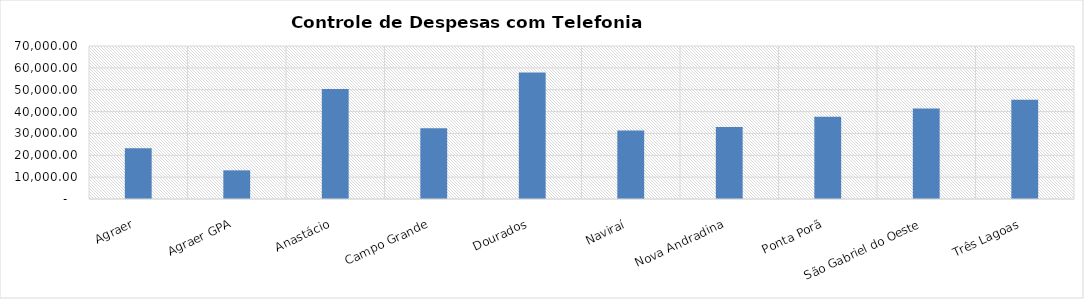
| Category | Series 0 |
|---|---|
| Agraer | 23269.63 |
| Agraer GPA | 13112.44 |
| Anastácio | 50313.66 |
| Campo Grande | 32317.64 |
| Dourados | 57924.74 |
| Naviraí | 31353.98 |
| Nova Andradina | 32995.3 |
| Ponta Porã | 37665.72 |
| São Gabriel do Oeste | 41382.97 |
| Três Lagoas | 45432.43 |